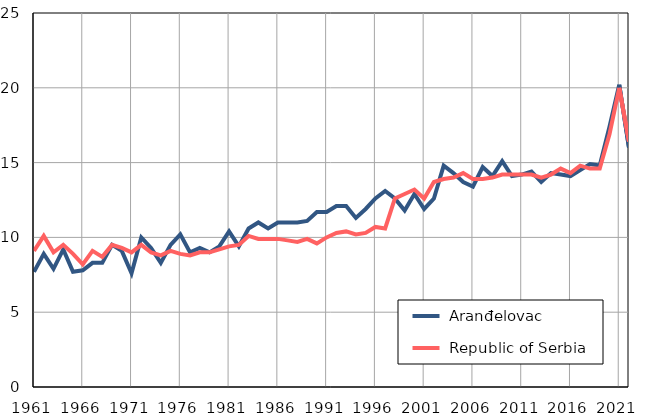
| Category |  Aranđelovac |  Republic of Serbia |
|---|---|---|
| 1961.0 | 7.7 | 9.1 |
| 1962.0 | 8.9 | 10.1 |
| 1963.0 | 7.9 | 9 |
| 1964.0 | 9.2 | 9.5 |
| 1965.0 | 7.7 | 8.9 |
| 1966.0 | 7.8 | 8.2 |
| 1967.0 | 8.3 | 9.1 |
| 1968.0 | 8.3 | 8.7 |
| 1969.0 | 9.5 | 9.5 |
| 1970.0 | 9.1 | 9.3 |
| 1971.0 | 7.6 | 9 |
| 1972.0 | 10 | 9.5 |
| 1973.0 | 9.3 | 9 |
| 1974.0 | 8.3 | 8.8 |
| 1975.0 | 9.5 | 9.1 |
| 1976.0 | 10.2 | 8.9 |
| 1977.0 | 9 | 8.8 |
| 1978.0 | 9.3 | 9 |
| 1979.0 | 9 | 9 |
| 1980.0 | 9.4 | 9.2 |
| 1981.0 | 10.4 | 9.4 |
| 1982.0 | 9.4 | 9.5 |
| 1983.0 | 10.6 | 10.1 |
| 1984.0 | 11 | 9.9 |
| 1985.0 | 10.6 | 9.9 |
| 1986.0 | 11 | 9.9 |
| 1987.0 | 11 | 9.8 |
| 1988.0 | 11 | 9.7 |
| 1989.0 | 11.1 | 9.9 |
| 1990.0 | 11.7 | 9.6 |
| 1991.0 | 11.7 | 10 |
| 1992.0 | 12.1 | 10.3 |
| 1993.0 | 12.1 | 10.4 |
| 1994.0 | 11.3 | 10.2 |
| 1995.0 | 11.9 | 10.3 |
| 1996.0 | 12.6 | 10.7 |
| 1997.0 | 13.1 | 10.6 |
| 1998.0 | 12.6 | 12.6 |
| 1999.0 | 11.8 | 12.9 |
| 2000.0 | 12.9 | 13.2 |
| 2001.0 | 11.9 | 12.6 |
| 2002.0 | 12.6 | 13.7 |
| 2003.0 | 14.8 | 13.9 |
| 2004.0 | 14.3 | 14 |
| 2005.0 | 13.7 | 14.3 |
| 2006.0 | 13.4 | 13.9 |
| 2007.0 | 14.7 | 13.9 |
| 2008.0 | 14.1 | 14 |
| 2009.0 | 15.1 | 14.2 |
| 2010.0 | 14.1 | 14.2 |
| 2011.0 | 14.2 | 14.2 |
| 2012.0 | 14.4 | 14.2 |
| 2013.0 | 13.7 | 14 |
| 2014.0 | 14.3 | 14.2 |
| 2015.0 | 14.2 | 14.6 |
| 2016.0 | 14.1 | 14.3 |
| 2017.0 | 14.5 | 14.8 |
| 2018.0 | 14.9 | 14.6 |
| 2019.0 | 14.8 | 14.6 |
| 2020.0 | 17.4 | 16.9 |
| 2021.0 | 20.2 | 20 |
| 2022.0 | 16 | 16.4 |